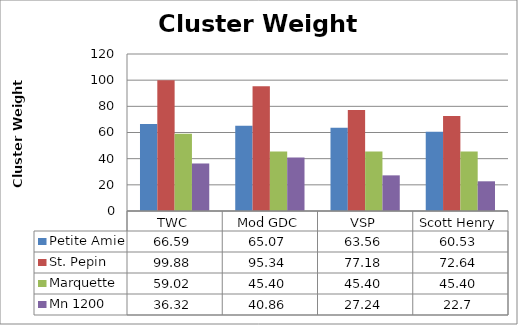
| Category | Petite Amie | St. Pepin | Marquette | Mn 1200 |
|---|---|---|---|---|
| 0 | 66.59 | 99.88 | 59.02 | 36.32 |
| 1 | 65.07 | 95.34 | 45.4 | 40.86 |
| 2 | 63.56 | 77.18 | 45.4 | 27.24 |
| 3 | 60.53 | 72.64 | 45.4 | 22.7 |